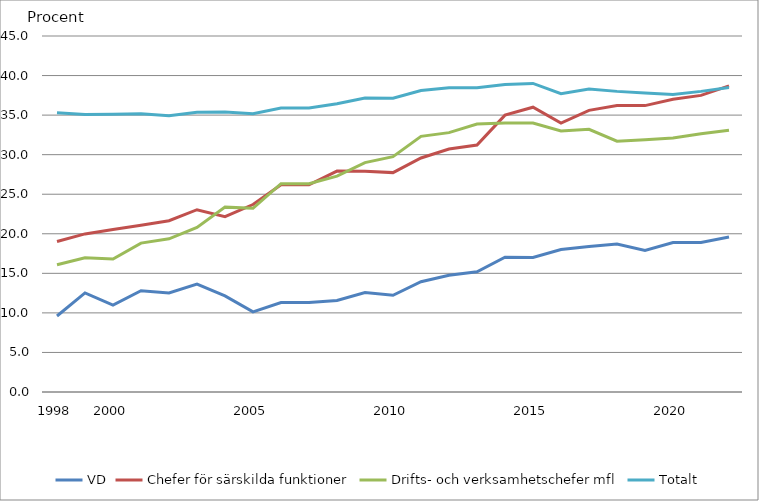
| Category | VD | Chefer för särskilda funktioner | Drifts- och verksamhetschefer mfl | Totalt |
|---|---|---|---|---|
| 1998.0 | 9.604 | 19.033 | 16.089 | 35.292 |
| nan | 12.521 | 19.982 | 16.974 | 35.071 |
| 2000.0 | 10.98 | 20.55 | 16.808 | 35.123 |
| nan | 12.797 | 21.08 | 18.819 | 35.167 |
| nan | 12.53 | 21.651 | 19.368 | 34.917 |
| nan | 13.641 | 23.042 | 20.809 | 35.372 |
| nan | 12.145 | 22.169 | 23.367 | 35.387 |
| 2005.0 | 10.126 | 23.7 | 23.22 | 35.175 |
| nan | 11.308 | 26.188 | 26.336 | 35.888 |
| nan | 11.308 | 26.188 | 26.336 | 35.888 |
| nan | 11.56 | 27.929 | 27.28 | 36.429 |
| nan | 12.574 | 27.894 | 28.99 | 37.173 |
| 2010.0 | 12.227 | 27.73 | 29.748 | 37.138 |
| nan | 13.946 | 29.585 | 32.315 | 38.103 |
| nan | 14.745 | 30.709 | 32.787 | 38.453 |
| nan | 15.187 | 31.225 | 33.875 | 38.458 |
| nan | 17.042 | 35 | 34 | 38.86 |
| 2015.0 | 17 | 36 | 34 | 39 |
| nan | 18 | 34 | 33 | 37.7 |
| nan | 18.4 | 35.6 | 33.2 | 38.3 |
| nan | 18.7 | 36.2 | 31.7 | 38 |
| nan | 17.9 | 36.2 | 31.9 | 37.8 |
| 2020.0 | 18.9 | 37 | 32.1 | 37.6 |
| nan | 18.895 | 37.491 | 32.655 | 38 |
| nan | 19.6 | 38.7 | 33.1 | 38.5 |